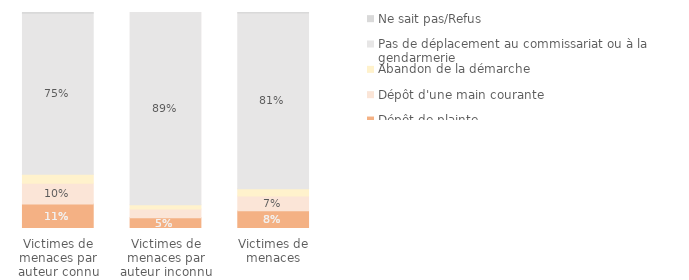
| Category | Dépôt de plainte | Dépôt d'une main courante | Abandon de la démarche | Pas de déplacement au commissariat ou à la gendarmerie | Ne sait pas/Refus |
|---|---|---|---|---|---|
| Victimes de menaces par auteur connu | 0.114 | 0.095 | 0.042 | 0.746 | 0.003 |
| Victimes de menaces par auteur inconnu | 0.05 | 0.04 | 0.02 | 0.89 | 0 |
| Victimes de menaces | 0.082 | 0.068 | 0.033 | 0.814 | 0.002 |